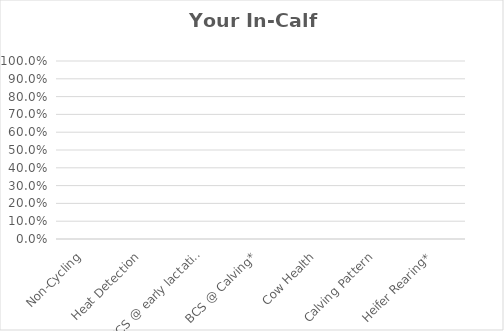
| Category | 6-Week In-Calf Rate Gap |
|---|---|
| Non-Cycling | 0 |
| Heat Detection | 0 |
| BCS @ early lactation | 0 |
| BCS @ Calving* | 0 |
| Cow Health | 0 |
| Calving Pattern | 0 |
| Heifer Rearing* | 0 |